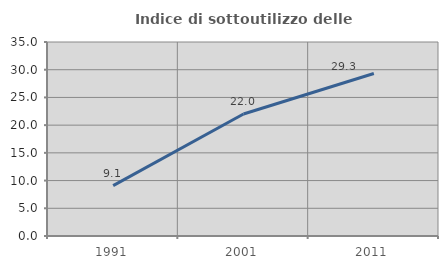
| Category | Indice di sottoutilizzo delle abitazioni  |
|---|---|
| 1991.0 | 9.091 |
| 2001.0 | 22 |
| 2011.0 | 29.31 |